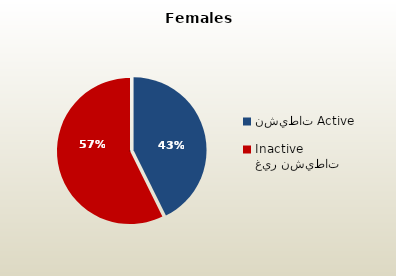
| Category | الاناث القطريات  Qatari Females |
|---|---|
| نشيطات Active | 47709 |
| غير نشيطات Inactive | 64059 |